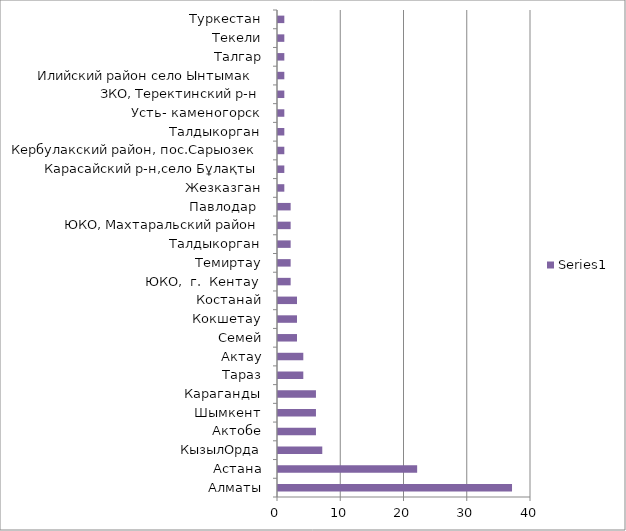
| Category | Series 0 |
|---|---|
| Алматы | 37 |
| Астана | 22 |
| КызылОрда | 7 |
| Актобе | 6 |
| Шымкент | 6 |
| Караганды | 6 |
| Тараз | 4 |
| Актау | 4 |
| Семей | 3 |
| Кокшетау | 3 |
| Костанай | 3 |
| ЮКО,  г.  Кентау | 2 |
| Темиртау | 2 |
| Талдыкорган | 2 |
| ЮКО, Махтаральский район | 2 |
| Павлодар  | 2 |
| Жезказган | 1 |
| Карасайский р-н,село Бұлақты | 1 |
| Кербулакский район, пос.Сарыозек | 1 |
| Талдыкорган | 1 |
| Усть- каменогорск | 1 |
| ЗКО, Теректинский р-н | 1 |
| Илийский район село Ынтымак  | 1 |
| Талгар | 1 |
| Текели | 1 |
| Туркестан | 1 |